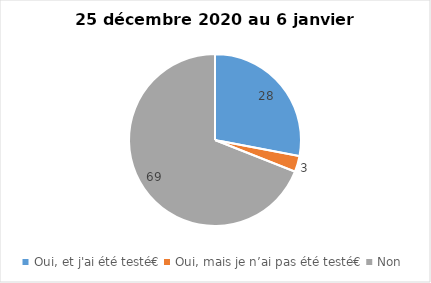
| Category | Series 0 |
|---|---|
| Oui, et j'ai été testé€ | 28 |
| Oui, mais je n’ai pas été testé€ | 3 |
| Non | 69 |